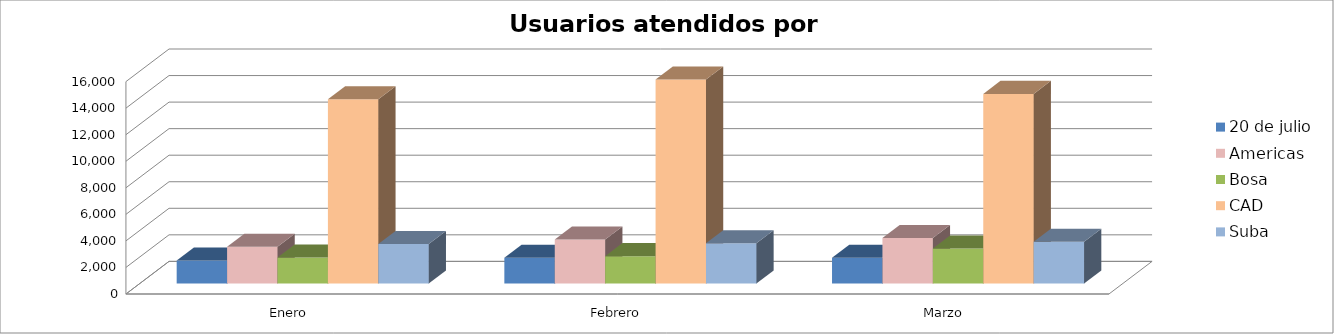
| Category | 20 de julio | Americas | Bosa | CAD | Suba |
|---|---|---|---|---|---|
| Enero | 1728 | 2775 | 1953 | 13884 | 2975 |
| Febrero | 1945 | 3308 | 2061 | 15370 | 3028 |
| Marzo | 1938 | 3423 | 2641 | 14286 | 3141 |